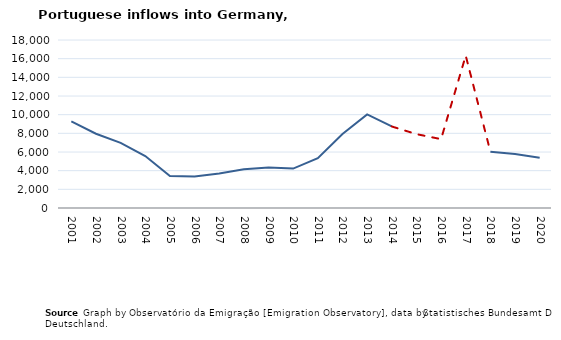
| Category | Entradas |
|---|---|
| 2001.0 | 9287 |
| 2002.0 | 7955 |
| 2003.0 | 6981 |
| 2004.0 | 5570 |
| 2005.0 | 3418 |
| 2006.0 | 3371 |
| 2007.0 | 3700 |
| 2008.0 | 4140 |
| 2009.0 | 4330 |
| 2010.0 | 4220 |
| 2011.0 | 5340 |
| 2012.0 | 7930 |
| 2013.0 | 10030 |
| 2014.0 | 8735 |
| 2015.0 | 7915 |
| 2016.0 | 7380 |
| 2017.0 | 16325 |
| 2018.0 | 6035 |
| 2019.0 | 5785 |
| 2020.0 | 5380 |